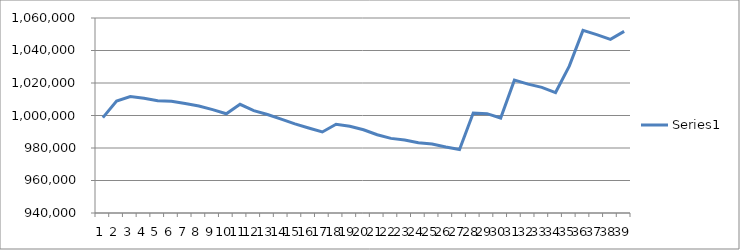
| Category | Series 0 |
|---|---|
| 0 | 998686.053 |
| 1 | 1008858.374 |
| 2 | 1011647.819 |
| 3 | 1010662.359 |
| 4 | 1009100.7 |
| 5 | 1008772.213 |
| 6 | 1007409.801 |
| 7 | 1005875.067 |
| 8 | 1003618.74 |
| 9 | 1001077.006 |
| 10 | 1006865.913 |
| 11 | 1002950.996 |
| 12 | 1000624.663 |
| 13 | 997802.908 |
| 14 | 994857.297 |
| 15 | 992320.948 |
| 16 | 989843.834 |
| 17 | 994631.125 |
| 18 | 993387.184 |
| 19 | 991195.477 |
| 20 | 988169.09 |
| 21 | 985923.533 |
| 22 | 984948.842 |
| 23 | 983257.943 |
| 24 | 982444.803 |
| 25 | 980608.508 |
| 26 | 979019.925 |
| 27 | 1001523.963 |
| 28 | 1001141.626 |
| 29 | 998449.111 |
| 30 | 1021760.905 |
| 31 | 1019289.176 |
| 32 | 1017302.1 |
| 33 | 1014135.703 |
| 34 | 1030366.182 |
| 35 | 1052385.568 |
| 36 | 1049795.369 |
| 37 | 1046849.758 |
| 38 | 1051744.75 |